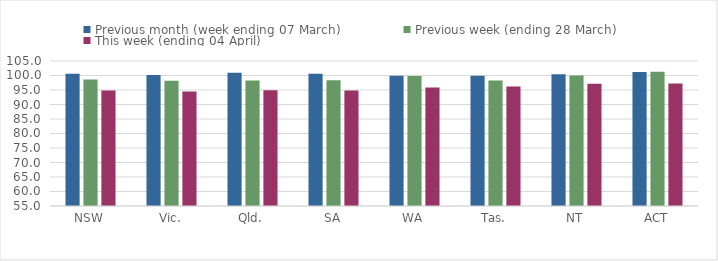
| Category | Previous month (week ending 07 March) | Previous week (ending 28 March) | This week (ending 04 April) |
|---|---|---|---|
| NSW | 100.608 | 98.635 | 94.839 |
| Vic. | 100.134 | 98.176 | 94.484 |
| Qld. | 100.915 | 98.275 | 94.944 |
| SA | 100.602 | 98.34 | 94.8 |
| WA | 99.94 | 99.807 | 95.868 |
| Tas. | 99.923 | 98.288 | 96.221 |
| NT | 100.41 | 99.968 | 97.13 |
| ACT | 101.237 | 101.263 | 97.274 |